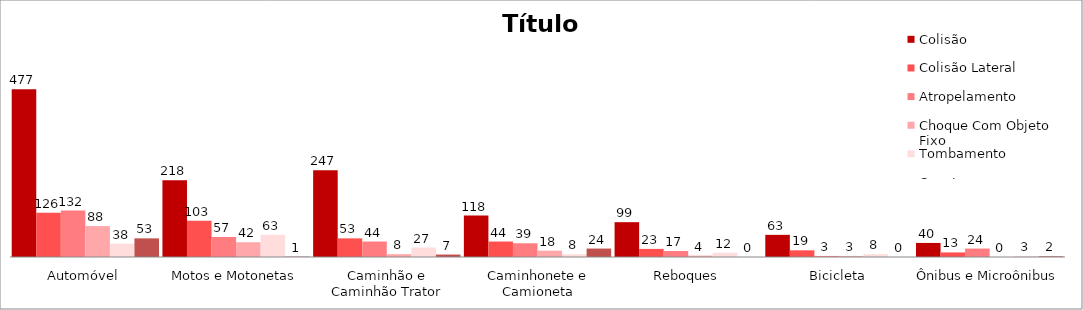
| Category | Colisão | Colisão Lateral | Atropelamento | Choque Com Objeto Fixo | Tombamento | Capotagem |
|---|---|---|---|---|---|---|
| Automóvel | 477 | 126 | 132 | 88 | 38 | 53 |
| Motos e Motonetas | 218 | 103 | 57 | 42 | 63 | 1 |
| Caminhão e Caminhão Trator | 247 | 53 | 44 | 8 | 27 | 7 |
| Caminhonete e Camioneta | 118 | 44 | 39 | 18 | 8 | 24 |
| Reboques | 99 | 23 | 17 | 4 | 12 | 0 |
| Bicicleta | 63 | 19 | 3 | 3 | 8 | 0 |
| Ônibus e Microônibus | 40 | 13 | 24 | 0 | 3 | 2 |